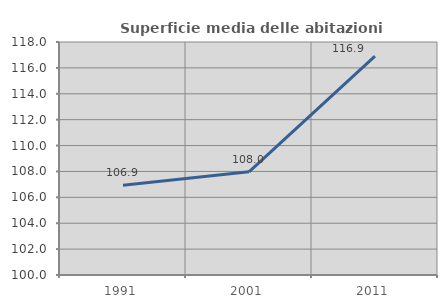
| Category | Superficie media delle abitazioni occupate |
|---|---|
| 1991.0 | 106.94 |
| 2001.0 | 107.973 |
| 2011.0 | 116.904 |